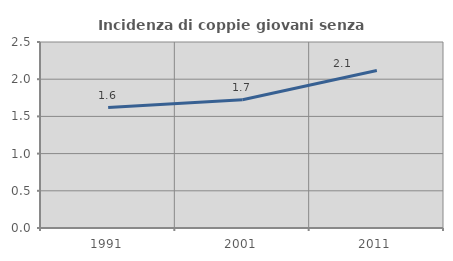
| Category | Incidenza di coppie giovani senza figli |
|---|---|
| 1991.0 | 1.619 |
| 2001.0 | 1.724 |
| 2011.0 | 2.116 |